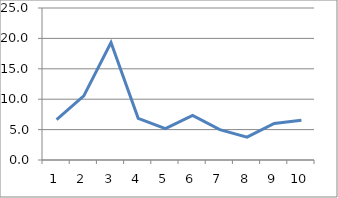
| Category | Series 0 |
|---|---|
| 0 | 6.625 |
| 1 | 10.545 |
| 2 | 19.333 |
| 3 | 6.846 |
| 4 | 5.158 |
| 5 | 7.333 |
| 6 | 5 |
| 7 | 3.765 |
| 8 | 6 |
| 9 | 6.545 |